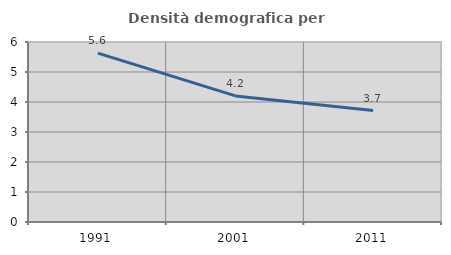
| Category | Densità demografica |
|---|---|
| 1991.0 | 5.627 |
| 2001.0 | 4.204 |
| 2011.0 | 3.714 |